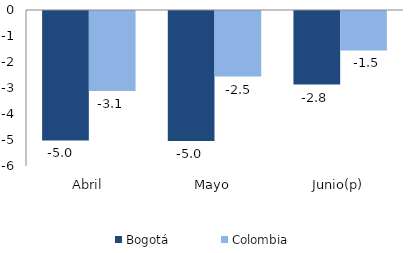
| Category | Bogotá | Colombia |
|---|---|---|
| Abril | -4.981 | -3.079 |
| Mayo | -4.999 | -2.52 |
| Junio(p) | -2.829 | -1.518 |